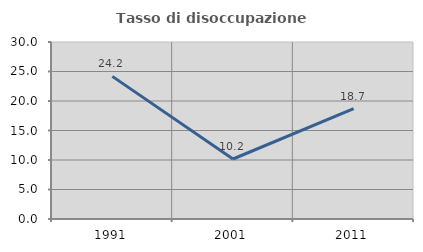
| Category | Tasso di disoccupazione giovanile  |
|---|---|
| 1991.0 | 24.176 |
| 2001.0 | 10.169 |
| 2011.0 | 18.692 |